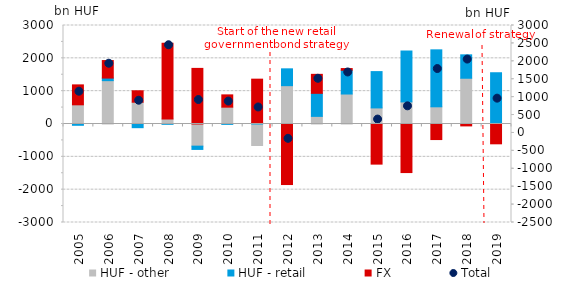
| Category | HUF - other | HUF - retail | FX |
|---|---|---|---|
| 2005.0 | 584.35 | -39.69 | 607.16 |
| 2006.0 | 1320.09 | 78.72 | 533.73 |
| 2007.0 | 663.71 | -112.25 | 348.22 |
| 2008.0 | 155.33 | -8.54 | 2302.2 |
| 2009.0 | -674.312 | -100.014 | 1693.697 |
| 2010.0 | 512.982 | -10.976 | 374.253 |
| 2011.0 | -654.178 | 38.141 | 1327.651 |
| 2012.0 | 1167.398 | 512.809 | -1843.831 |
| 2013.0 | 232.065 | 701.943 | 578.348 |
| 2014.0 | 913.084 | 722.552 | 52.951 |
| 2015.0 | 489.602 | 1106.29 | -1222.101 |
| 2016.0 | 672.405 | 1550.527 | -1479.292 |
| 2017.0 | 523.601 | 1734.945 | -473.961 |
| 2018.0 | 1393.682 | 712.858 | -57.778 |
| 2019.0 | 2.834 | 1558.305 | -603.578 |